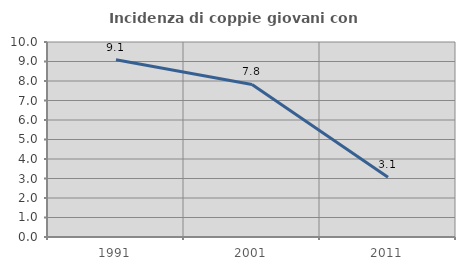
| Category | Incidenza di coppie giovani con figli |
|---|---|
| 1991.0 | 9.091 |
| 2001.0 | 7.822 |
| 2011.0 | 3.063 |